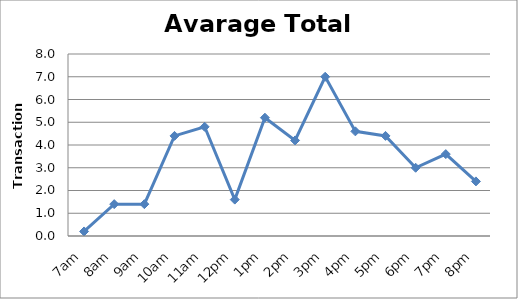
| Category | Series 0 |
|---|---|
| 7am | 0.2 |
| 8am | 1.4 |
| 9am | 1.4 |
| 10am | 4.4 |
| 11am | 4.8 |
| 12pm | 1.6 |
| 1pm | 5.2 |
| 2pm | 4.2 |
| 3pm | 7 |
| 4pm | 4.6 |
| 5pm | 4.4 |
| 6pm | 3 |
| 7pm | 3.6 |
| 8pm | 2.4 |